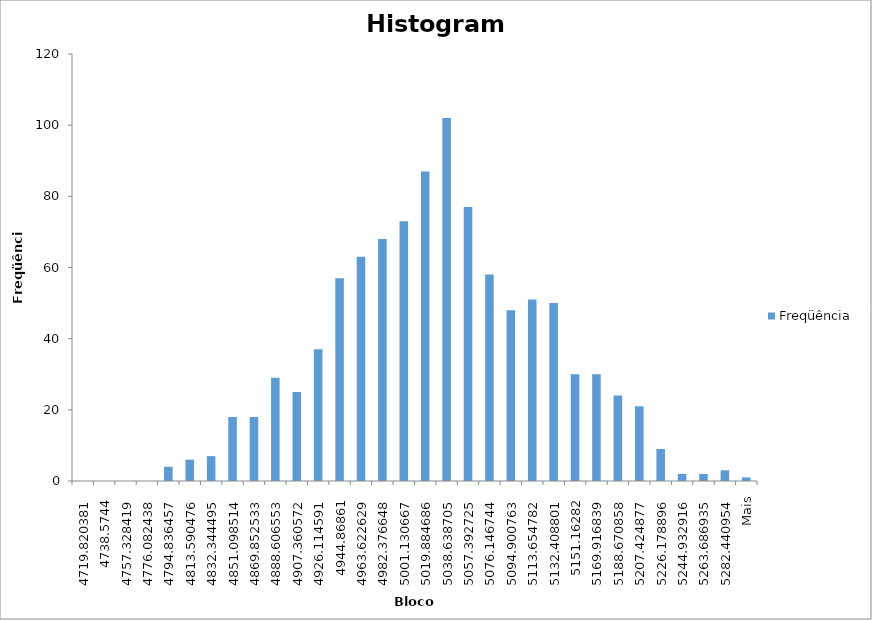
| Category | Freqüência |
|---|---|
| 4719,820381 | 0 |
| 4738,5744 | 0 |
| 4757,328419 | 0 |
| 4776,082438 | 0 |
| 4794,836457 | 4 |
| 4813,590476 | 6 |
| 4832,344495 | 7 |
| 4851,098514 | 18 |
| 4869,852533 | 18 |
| 4888,606553 | 29 |
| 4907,360572 | 25 |
| 4926,114591 | 37 |
| 4944,86861 | 57 |
| 4963,622629 | 63 |
| 4982,376648 | 68 |
| 5001,130667 | 73 |
| 5019,884686 | 87 |
| 5038,638705 | 102 |
| 5057,392725 | 77 |
| 5076,146744 | 58 |
| 5094,900763 | 48 |
| 5113,654782 | 51 |
| 5132,408801 | 50 |
| 5151,16282 | 30 |
| 5169,916839 | 30 |
| 5188,670858 | 24 |
| 5207,424877 | 21 |
| 5226,178896 | 9 |
| 5244,932916 | 2 |
| 5263,686935 | 2 |
| 5282,440954 | 3 |
| Mais | 1 |